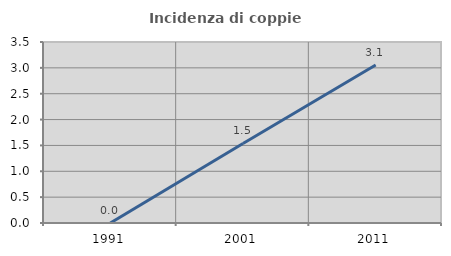
| Category | Incidenza di coppie miste |
|---|---|
| 1991.0 | 0 |
| 2001.0 | 1.538 |
| 2011.0 | 3.056 |